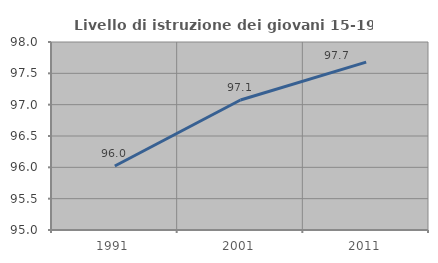
| Category | Livello di istruzione dei giovani 15-19 anni |
|---|---|
| 1991.0 | 96.022 |
| 2001.0 | 97.075 |
| 2011.0 | 97.679 |